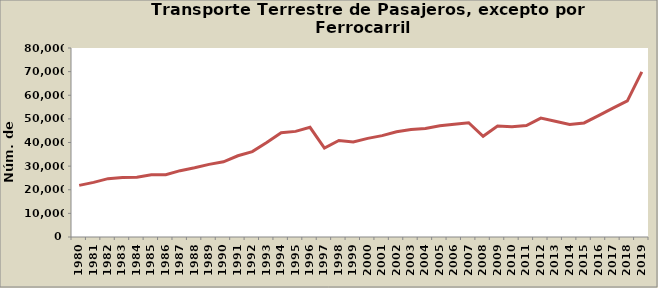
| Category | Series 0 |
|---|---|
| 1980.0 | 21840 |
| 1981.0 | 23120 |
| 1982.0 | 24701 |
| 1983.0 | 25225 |
| 1984.0 | 25268 |
| 1985.0 | 26316 |
| 1986.0 | 26382 |
| 1987.0 | 28073 |
| 1988.0 | 29279 |
| 1989.0 | 30735 |
| 1990.0 | 31811 |
| 1991.0 | 34380 |
| 1992.0 | 36140 |
| 1993.0 | 39997 |
| 1994.0 | 44109 |
| 1995.0 | 44711 |
| 1996.0 | 46427 |
| 1997.0 | 37643 |
| 1998.0 | 40846 |
| 1999.0 | 40197 |
| 2000.0 | 41758 |
| 2001.0 | 42899 |
| 2002.0 | 44573 |
| 2003.0 | 45485 |
| 2004.0 | 45906 |
| 2005.0 | 47092 |
| 2006.0 | 47751 |
| 2007.0 | 48374 |
| 2008.0 | 42648 |
| 2009.0 | 46948 |
| 2010.0 | 46658 |
| 2011.0 | 47172 |
| 2012.0 | 50312 |
| 2013.0 | 48981 |
| 2014.0 | 47610 |
| 2015.0 | 48287 |
| 2016.0 | 51371 |
| 2017.0 | 54531 |
| 2018.0 | 57599 |
| 2019.0 | 69871 |